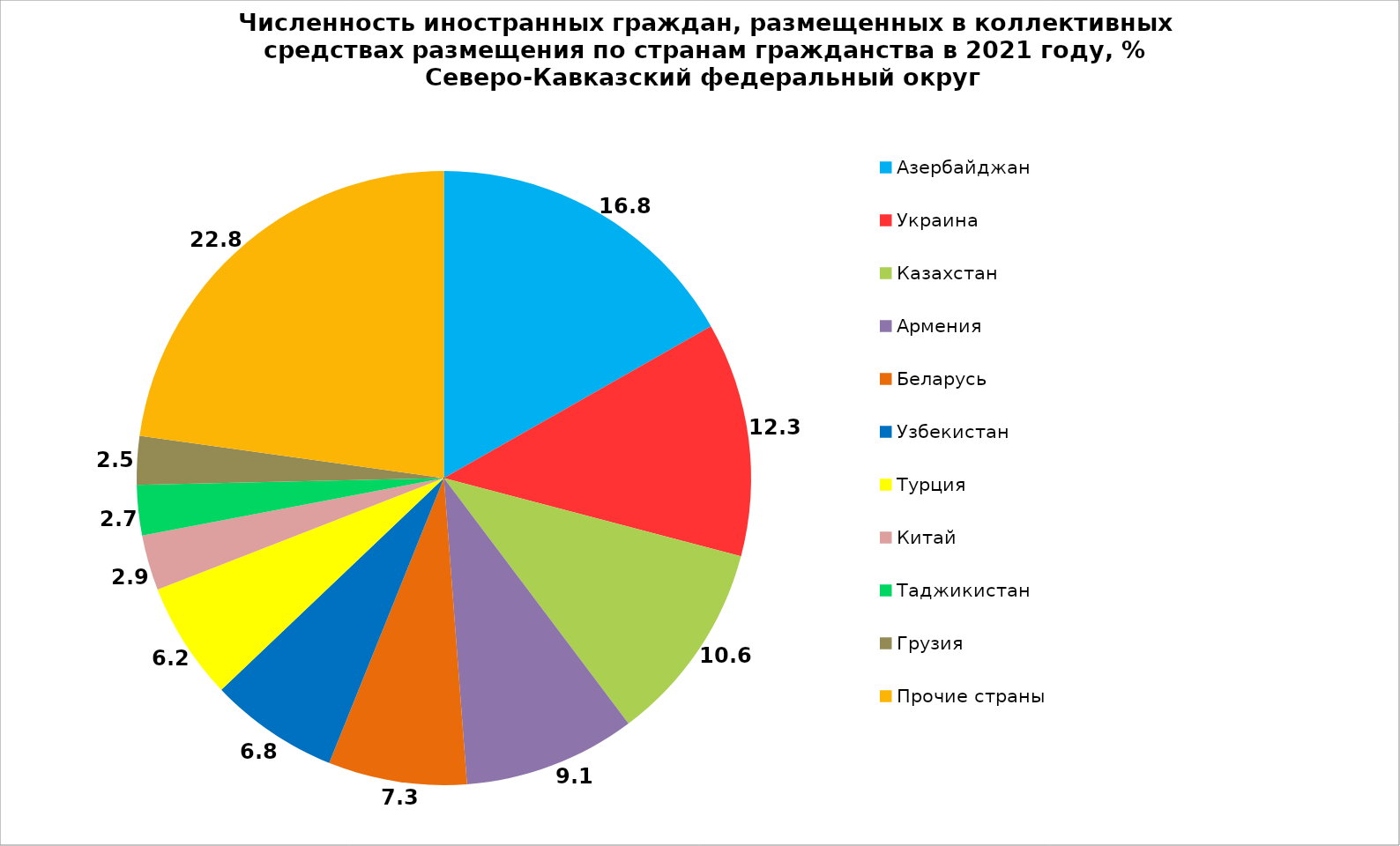
| Category | Series 0 |
|---|---|
| Азербайджан | 16.766 |
| Украина | 12.331 |
| Казахстан | 10.644 |
| Армения | 9.059 |
| Беларусь | 7.289 |
| Узбекистан | 6.804 |
| Турция | 6.198 |
| Китай | 2.907 |
| Таджикистан | 2.651 |
| Грузия | 2.549 |
| Прочие страны | 22.802 |